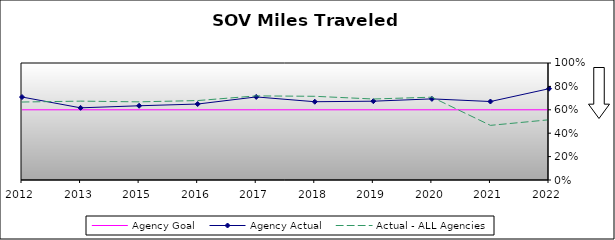
| Category | Agency Goal | Agency Actual | Actual - ALL Agencies |
|---|---|---|---|
| 2012.0 | 0.6 | 0.709 | 0.666 |
| 2013.0 | 0.6 | 0.617 | 0.674 |
| 2015.0 | 0.6 | 0.634 | 0.668 |
| 2016.0 | 0.6 | 0.649 | 0.679 |
| 2017.0 | 0.6 | 0.71 | 0.719 |
| 2018.0 | 0.6 | 0.669 | 0.715 |
| 2019.0 | 0.6 | 0.674 | 0.692 |
| 2020.0 | 0.6 | 0.693 | 0.708 |
| 2021.0 | 0.6 | 0.671 | 0.467 |
| 2022.0 | 0.6 | 0.78 | 0.515 |